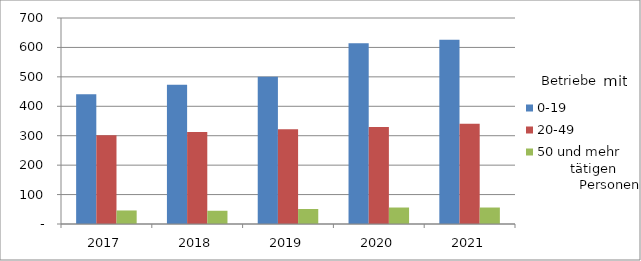
| Category | 0-19 | 20-49 | 50 und mehr |
|---|---|---|---|
| 2017.0 | 441 | 302 | 46 |
| 2018.0 | 473 | 313 | 45 |
| 2019.0 | 500 | 322 | 51 |
| 2020.0 | 614 | 330 | 56 |
| 2021.0 | 626 | 341 | 56 |